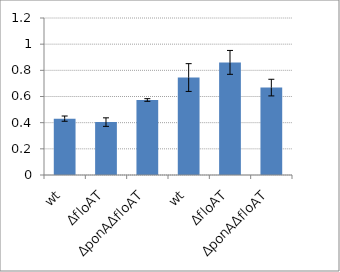
| Category | Series 0 |
|---|---|
| wt | 0.431 |
| ΔfloAT | 0.404 |
| ΔponAΔfloAT | 0.573 |
| wt | 0.745 |
| ΔfloAT | 0.861 |
| ΔponAΔfloAT | 0.668 |